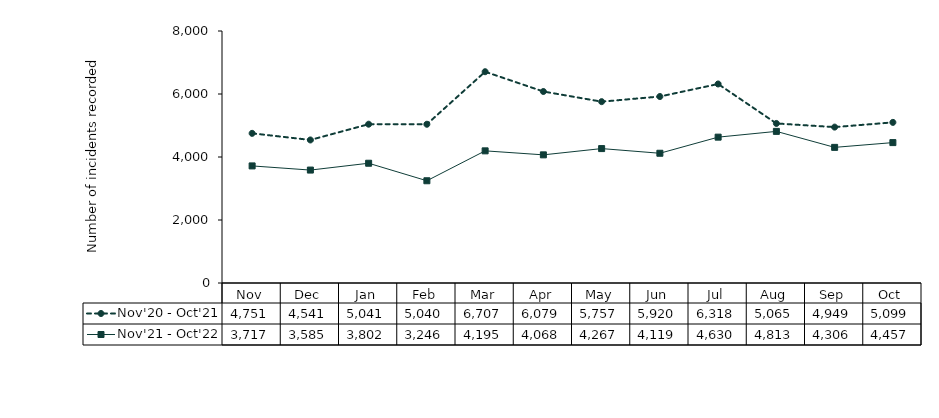
| Category | Nov'20 - Oct'21 | Nov'21 - Oct'22 |
|---|---|---|
| Nov | 4751 | 3717 |
| Dec | 4541 | 3585 |
| Jan | 5041 | 3802 |
| Feb | 5040 | 3246 |
| Mar | 6707 | 4195 |
| Apr | 6079 | 4068 |
| May | 5757 | 4267 |
| Jun | 5920 | 4119 |
| Jul | 6318 | 4630 |
| Aug | 5065 | 4813 |
| Sep | 4949 | 4306 |
| Oct | 5099 | 4457 |